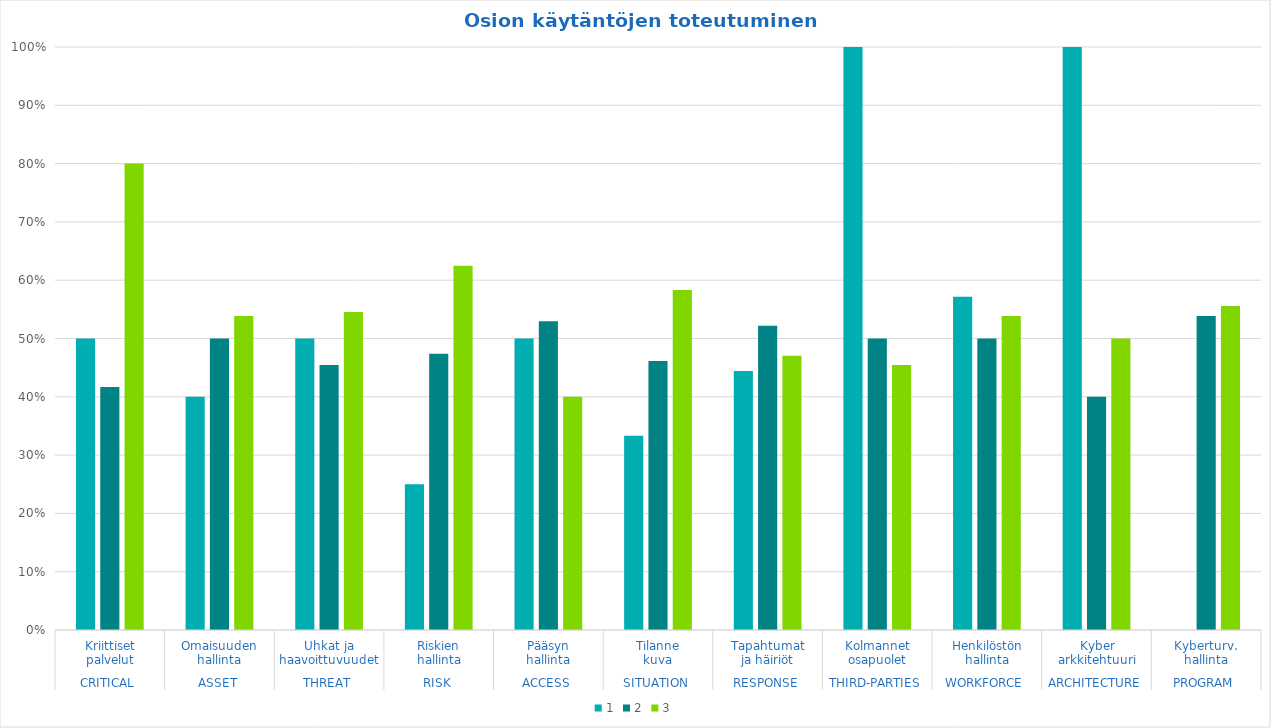
| Category | 1 | 2 | 3 |
|---|---|---|---|
| 0 | 0.5 | 0.417 | 0.8 |
| 1 | 0.4 | 0.5 | 0.538 |
| 2 | 0.5 | 0.455 | 0.545 |
| 3 | 0.25 | 0.474 | 0.625 |
| 4 | 0.5 | 0.529 | 0.4 |
| 5 | 0.333 | 0.462 | 0.583 |
| 6 | 0.444 | 0.522 | 0.471 |
| 7 | 1 | 0.5 | 0.455 |
| 8 | 0.571 | 0.5 | 0.538 |
| 9 | 1 | 0.4 | 0.5 |
| 10 | 0 | 0.538 | 0.556 |